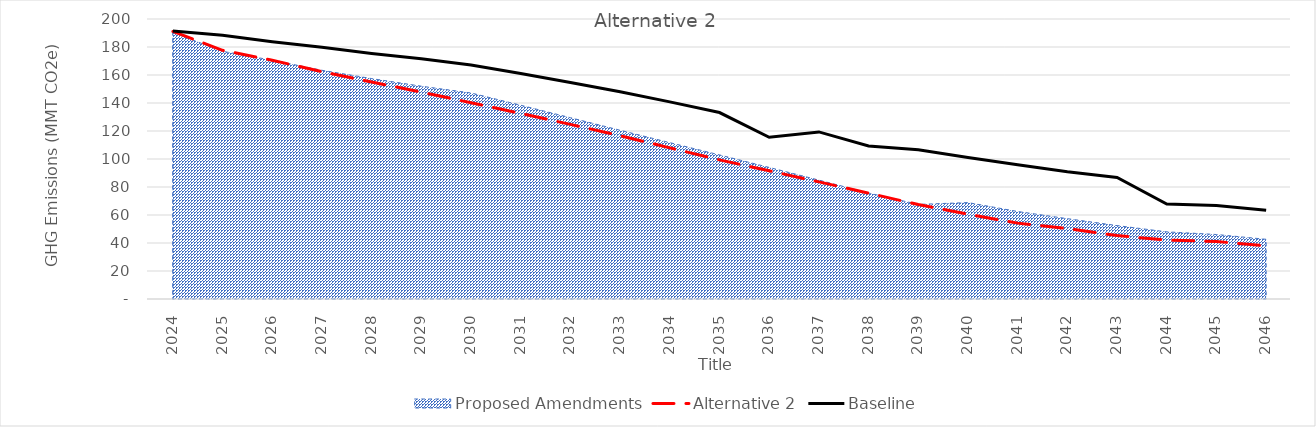
| Category | Alternative 2 | Baseline  |
|---|---|---|
| 2024.0 | 191.11 | 191.357 |
| 2025.0 | 177.619 | 188.439 |
| 2026.0 | 170.547 | 183.798 |
| 2027.0 | 162.338 | 179.753 |
| 2028.0 | 154.946 | 175.419 |
| 2029.0 | 147.799 | 171.532 |
| 2030.0 | 140.198 | 167.16 |
| 2031.0 | 132.555 | 161.031 |
| 2032.0 | 124.73 | 154.691 |
| 2033.0 | 116.669 | 148.038 |
| 2034.0 | 107.934 | 140.791 |
| 2035.0 | 99.384 | 133.188 |
| 2036.0 | 91.554 | 115.548 |
| 2037.0 | 83.666 | 119.355 |
| 2038.0 | 75.615 | 109.345 |
| 2039.0 | 67.452 | 106.623 |
| 2040.0 | 60.53 | 101.123 |
| 2041.0 | 54.198 | 95.876 |
| 2042.0 | 50.261 | 90.88 |
| 2043.0 | 45.312 | 86.822 |
| 2044.0 | 42.044 | 67.842 |
| 2045.0 | 41.09 | 66.703 |
| 2046.0 | 37.954 | 63.352 |